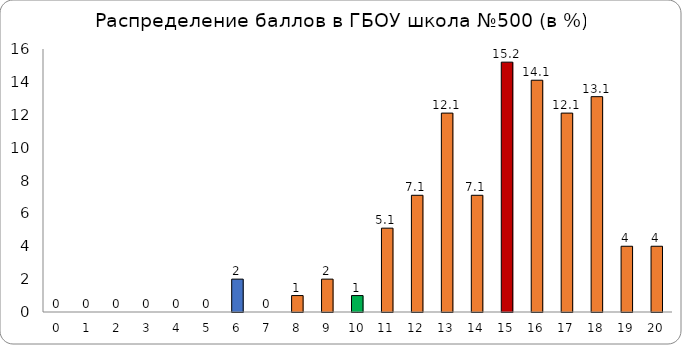
| Category | Series 0 |
|---|---|
| 0.0 | 0 |
| 1.0 | 0 |
| 2.0 | 0 |
| 3.0 | 0 |
| 4.0 | 0 |
| 5.0 | 0 |
| 6.0 | 2 |
| 7.0 | 0 |
| 8.0 | 1 |
| 9.0 | 2 |
| 10.0 | 1 |
| 11.0 | 5.1 |
| 12.0 | 7.1 |
| 13.0 | 12.1 |
| 14.0 | 7.1 |
| 15.0 | 15.2 |
| 16.0 | 14.1 |
| 17.0 | 12.1 |
| 18.0 | 13.1 |
| 19.0 | 4 |
| 20.0 | 4 |